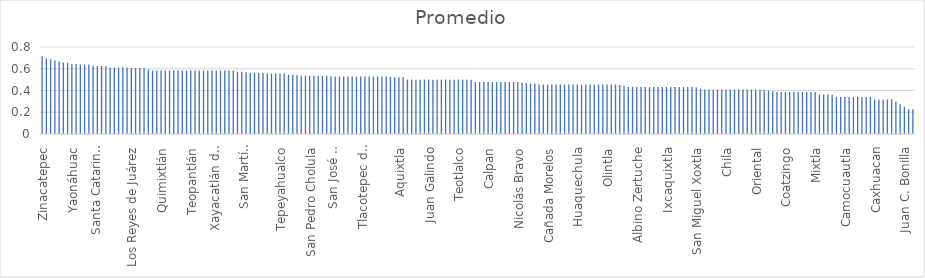
| Category | Pormedio |
|---|---|
| Zinacatepec | 0.714 |
| Xochiapulco | 0.694 |
| San Miguel Ixitlán | 0.688 |
| Zoquiapan | 0.679 |
| Teteles de Avila Castillo | 0.667 |
| San Felipe Tepatlán | 0.656 |
| Tlaola | 0.656 |
| Yaonáhuac | 0.643 |
| Zaragoza | 0.643 |
| Tlapacoya | 0.639 |
| Xiutetelco | 0.639 |
| Xochitlán de Vicente Suárez | 0.639 |
| San Jerónimo Xayacatlán | 0.625 |
| San Salvador Huixcolotla | 0.625 |
| Santa Catarina Tlaltempan | 0.625 |
| Santiago Miahuatlán | 0.625 |
| San Antonio Cañada | 0.611 |
| San Diego la Mesa Tochimiltzingo | 0.611 |
| Tianguismanalco | 0.611 |
| Tlahuapan | 0.611 |
| Zihuateutla | 0.611 |
| Los Reyes de Juárez | 0.607 |
| San Jerónimo Tecuanipan | 0.607 |
| San Matías Tlalancaleca | 0.607 |
| Teziutlán | 0.607 |
| Tepatlaxco de Hidalgo | 0.594 |
| Huehuetlán el Grande | 0.583 |
| Puebla | 0.583 |
| Quimixtlán | 0.583 |
| San Gabriel Chilac | 0.583 |
| San Gregorio Atzompa | 0.583 |
| San Nicolás de los Ranchos | 0.583 |
| Santa Inés Ahuatempan | 0.583 |
| Santo Tomás Hueyotlipan | 0.583 |
| Tecali de Herrera | 0.583 |
| Teopantlán | 0.583 |
| Tepeaca | 0.583 |
| Tepeojuma | 0.583 |
| Tetela de Ocampo | 0.583 |
| Tochimilco | 0.583 |
| Tzicatlacoyan | 0.583 |
| Vicente Guerrero | 0.583 |
| Xayacatlán de Bravo | 0.583 |
| Xochiltepec | 0.583 |
| Zacapala | 0.583 |
| Zacatlán | 0.583 |
| Tepanco de López | 0.571 |
| Tepango de Rodríguez | 0.571 |
| Jopala | 0.568 |
| San Martín Totoltepec | 0.562 |
| San Pedro Yeloixtlahuaca | 0.562 |
| Tlacuilotepec | 0.562 |
| Xochitlán Todos Santos | 0.562 |
| San Salvador el Verde | 0.556 |
| Soltepec | 0.556 |
| Tehuitzingo | 0.556 |
| Tepeyahualco | 0.556 |
| Zautla | 0.556 |
| Cuetzalan del Progreso | 0.545 |
| Honey | 0.545 |
| San Felipe Teotlalcingo | 0.542 |
| Rafael Lara Grajales | 0.536 |
| San Andrés Cholula | 0.536 |
| San Pedro Cholula | 0.536 |
| Santa Isabel Cholula | 0.536 |
| Tepetzintla | 0.536 |
| Tochtepec | 0.536 |
| Zapotitlán de Méndez | 0.536 |
| Tlapanalá | 0.531 |
| Quecholac | 0.528 |
| San José Miahuatlán | 0.528 |
| San Salvador el Seco | 0.528 |
| Tehuacán | 0.528 |
| Tepexco | 0.528 |
| Tepexi de Rodríguez | 0.528 |
| Tilapa | 0.528 |
| Tlachichuca | 0.528 |
| Tlacotepec de Benito Juárez | 0.528 |
| Tlatlauquitepec | 0.528 |
| Totoltepec de Guerrero | 0.528 |
| Xicotepec | 0.528 |
| Zapotitlán | 0.528 |
| San José Chiapa | 0.525 |
| Amozoc | 0.523 |
| Aquixtla | 0.523 |
| Pahuatlán | 0.523 |
| Acajete | 0.5 |
| Ahuacatlán | 0.5 |
| Atlixco | 0.5 |
| Chiconcuautla | 0.5 |
| Huauchinango | 0.5 |
| Juan Galindo | 0.5 |
| Molcaxac | 0.5 |
| Naupan | 0.5 |
| San Juan Atenco | 0.5 |
| Tecamachalco | 0.5 |
| Tecomatlán | 0.5 |
| Tenampulco | 0.5 |
| Teotlalco | 0.5 |
| Tepemaxalco | 0.5 |
| Yehualtepec | 0.5 |
| Zacapoaxtla | 0.5 |
| Acatzingo | 0.477 |
| Ahuatlán | 0.477 |
| Ayotoxco de Guerrero | 0.477 |
| Calpan | 0.477 |
| Caltepec | 0.477 |
| Chilchotla | 0.477 |
| Chinantla | 0.477 |
| Cuautinchán | 0.477 |
| Esperanza | 0.477 |
| Hueytamalco | 0.477 |
| Nicolás Bravo | 0.477 |
| San Nicolás Buenos Aires | 0.472 |
| San Pablo Anicano | 0.469 |
| Tepeyahualco de Cuauhtémoc | 0.464 |
| Tlaltenango | 0.464 |
| Ahuehuetitla | 0.455 |
| Ajalpan | 0.455 |
| Cañada Morelos | 0.455 |
| Chapulco | 0.455 |
| Chignahuapan | 0.455 |
| Coxcatlán | 0.455 |
| Cuyoaco | 0.455 |
| Epatlán | 0.455 |
| Guadalupe Victoria | 0.455 |
| Huaquechula | 0.455 |
| Huatlatlauca | 0.455 |
| Huehuetlán el Chico | 0.455 |
| Hueytlalpan | 0.455 |
| Ixtacamaxtitlán | 0.455 |
| Lafragua | 0.455 |
| Ocotepec | 0.455 |
| Olintla | 0.455 |
| Palmar de Bravo | 0.455 |
| Petlalcingo | 0.455 |
| Tlanepantla | 0.45 |
| Venustiano Carranza | 0.444 |
| Acatlán | 0.432 |
| Acteopan | 0.432 |
| Albino Zertuche | 0.432 |
| Chalchicomula de Sesma | 0.432 |
| Chiautla | 0.432 |
| Chignautla | 0.432 |
| Cohetzala | 0.432 |
| Francisco Z. Mena | 0.432 |
| Huehuetla | 0.432 |
| Ixcaquixtla | 0.432 |
| Jolalpan | 0.432 |
| La Magdalena Tlatlauquitepec | 0.432 |
| Mazapiltepec de Juárez | 0.432 |
| Nauzontla | 0.432 |
| Nopalucan | 0.432 |
| Piaxtla | 0.432 |
| San Miguel Xoxtla | 0.429 |
| Zoquitlán | 0.417 |
| Ahuazotepec | 0.409 |
| Altepexi | 0.409 |
| Atexcal | 0.409 |
| Atzitzintla | 0.409 |
| Axutla | 0.409 |
| Chila | 0.409 |
| Coyotepec | 0.409 |
| Cuautlancingo | 0.409 |
| Huitzilan de Serdán | 0.409 |
| Ixtepec | 0.409 |
| Izúcar de Matamoros | 0.409 |
| Nealtican | 0.409 |
| Oriental | 0.409 |
| Pantepec | 0.409 |
| Xicotlán | 0.406 |
| Tlaxco | 0.4 |
| San Juan Atzompa | 0.393 |
| Acateno | 0.386 |
| Chichiquila | 0.386 |
| Coatzingo | 0.386 |
| Cohuecan | 0.386 |
| Coronango | 0.386 |
| Coyomeapan | 0.386 |
| Huejotzingo | 0.386 |
| Hueyapan | 0.386 |
| Huitziltepec | 0.386 |
| Mixtla | 0.386 |
| Atoyatempan | 0.364 |
| Domingo Arenas | 0.364 |
| Ixcamilpa de Guerrero | 0.364 |
| San Sebastián Tlacotepec | 0.361 |
| Aljojuca | 0.341 |
| Amixtlán | 0.341 |
| Camocuautla | 0.341 |
| Chiautzingo | 0.341 |
| Chila de la Sal | 0.341 |
| Coatepec | 0.341 |
| Cuapiaxtla de Madero | 0.341 |
| Eloxochitlán | 0.341 |
| Guadalupe | 0.341 |
| Caxhuacan | 0.318 |
| Chigmecatitlán | 0.318 |
| Cuayuca de Andrade | 0.318 |
| General Felipe Ángeles | 0.318 |
| Jonotla | 0.318 |
| Hermenegildo Galeana | 0.295 |
| Atempan | 0.273 |
| Juan C. Bonilla | 0.25 |
| Atzala | 0.227 |
| Ocoyucan | 0.227 |